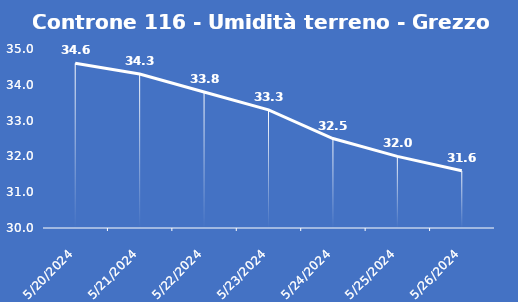
| Category | Controne 116 - Umidità terreno - Grezzo (%VWC) |
|---|---|
| 5/20/24 | 34.6 |
| 5/21/24 | 34.3 |
| 5/22/24 | 33.8 |
| 5/23/24 | 33.3 |
| 5/24/24 | 32.5 |
| 5/25/24 | 32 |
| 5/26/24 | 31.6 |